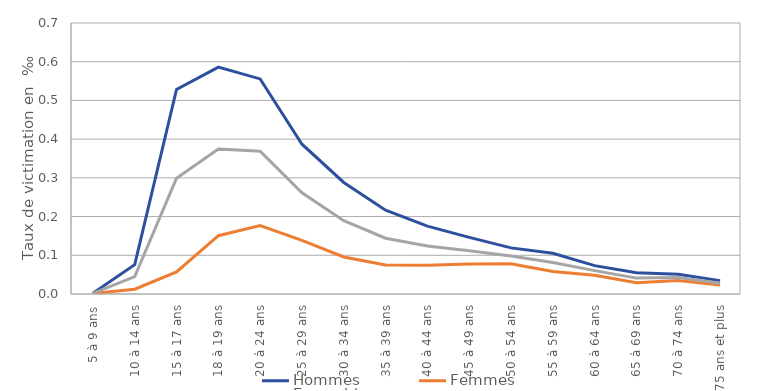
| Category | Hommes | Femmes | Ensemble |
|---|---|---|---|
| 5 à 9 ans | 0.002 | 0.002 | 0.002 |
| 10 à 14 ans | 0.076 | 0.012 | 0.045 |
| 15 à 17 ans | 0.528 | 0.057 | 0.299 |
| 18 à 19 ans | 0.586 | 0.151 | 0.375 |
| 20 à 24 ans | 0.556 | 0.177 | 0.369 |
| 25 à 29 ans | 0.387 | 0.138 | 0.262 |
| 30 à 34 ans | 0.288 | 0.096 | 0.189 |
| 35 à 39 ans | 0.217 | 0.075 | 0.144 |
| 40 à 44 ans | 0.175 | 0.074 | 0.124 |
| 45 à 49 ans | 0.146 | 0.078 | 0.112 |
| 50 à 54 ans | 0.119 | 0.078 | 0.098 |
| 55 à 59 ans | 0.105 | 0.058 | 0.081 |
| 60 à 64 ans | 0.073 | 0.049 | 0.06 |
| 65 à 69 ans | 0.055 | 0.029 | 0.041 |
| 70 à 74 ans | 0.051 | 0.035 | 0.042 |
| 75 ans et plus | 0.035 | 0.023 | 0.028 |